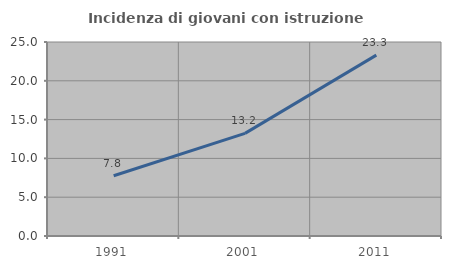
| Category | Incidenza di giovani con istruzione universitaria |
|---|---|
| 1991.0 | 7.766 |
| 2001.0 | 13.223 |
| 2011.0 | 23.307 |